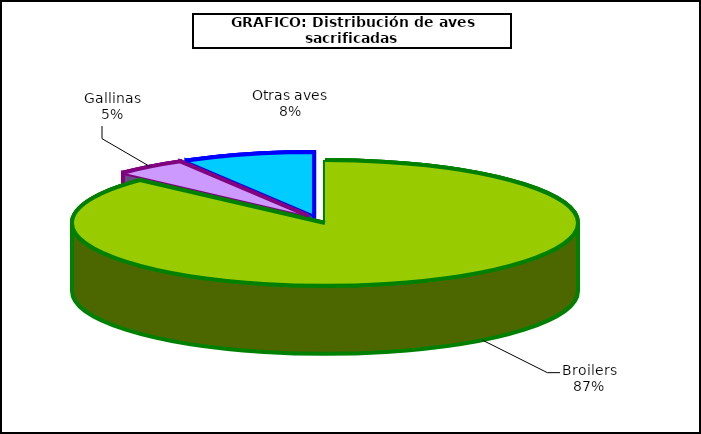
| Category | Series 0 |
|---|---|
| 0 | 695196.199 |
| 1 | 37050.057 |
| 2 | 67359.369 |